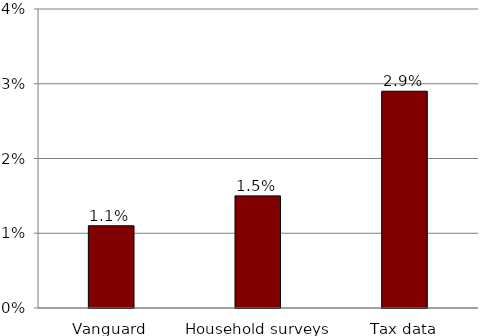
| Category | Series 0 |
|---|---|
| Vanguard | 0.011 |
| Household surveys | 0.015 |
| Tax data | 0.029 |